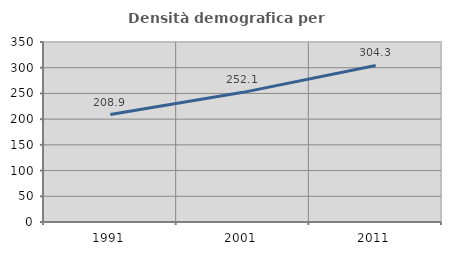
| Category | Densità demografica |
|---|---|
| 1991.0 | 208.879 |
| 2001.0 | 252.089 |
| 2011.0 | 304.309 |